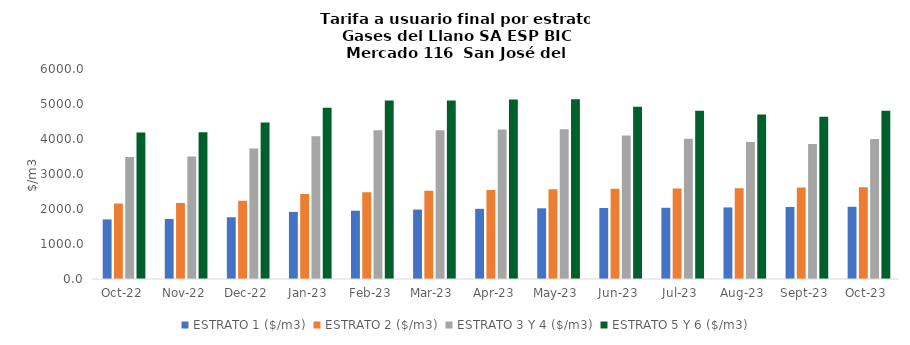
| Category | ESTRATO 1 ($/m3) | ESTRATO 2 ($/m3) | ESTRATO 3 Y 4 ($/m3) | ESTRATO 5 Y 6 ($/m3) |
|---|---|---|---|---|
| 2022-10-01 | 1702.57 | 2157.09 | 3487.76 | 4185.312 |
| 2022-11-01 | 1714.74 | 2172.52 | 3496.7 | 4196.04 |
| 2022-12-01 | 1763.93 | 2235.71 | 3725.2 | 4470.24 |
| 2023-01-01 | 1916.75 | 2431.28 | 4077.6 | 4893.12 |
| 2023-02-01 | 1951.54 | 2475.41 | 4250.37 | 5100.444 |
| 2023-03-01 | 1984.02 | 2519.25 | 4250.37 | 5100.444 |
| 2023-04-01 | 2005.09 | 2546.01 | 4273.76 | 5128.512 |
| 2023-05-01 | 2020.1 | 2565.07 | 4279.7 | 5135.64 |
| 2023-06-01 | 2028.44 | 2575.66 | 4098.64 | 4918.368 |
| 2023-07-01 | 2034.66 | 2583.55 | 4008.82 | 4810.584 |
| 2023-08-01 | 2044.67 | 2596.26 | 3914.14 | 4696.968 |
| 2023-09-01 | 2059.07 | 2614.55 | 3860.26 | 4632.312 |
| 2023-10-01 | 2063.47 | 2620.13 | 4003.57 | 4804.284 |